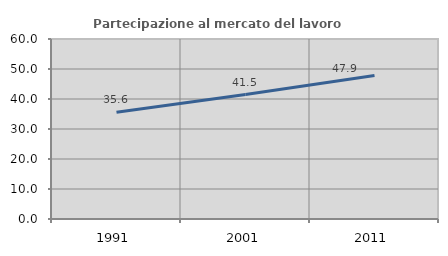
| Category | Partecipazione al mercato del lavoro  femminile |
|---|---|
| 1991.0 | 35.554 |
| 2001.0 | 41.476 |
| 2011.0 | 47.858 |